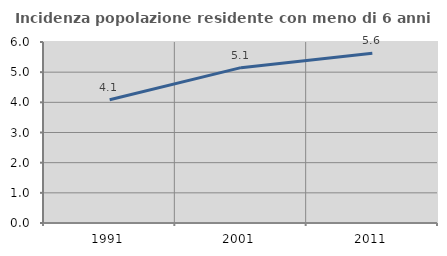
| Category | Incidenza popolazione residente con meno di 6 anni |
|---|---|
| 1991.0 | 4.083 |
| 2001.0 | 5.15 |
| 2011.0 | 5.625 |